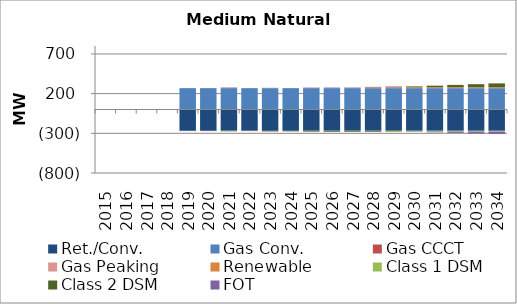
| Category | Ret./Conv. | Gas Conv. | Gas CCCT | Gas Peaking | Renewable | Class 1 DSM | Class 2 DSM | FOT |
|---|---|---|---|---|---|---|---|---|
| 2015.0 | 0 | 0 | 0 | 0 | 0 | 0 | -0.09 | 0.03 |
| 2016.0 | 0 | 0 | 0 | 0 | 0 | 0 | -0.1 | 0.035 |
| 2017.0 | 0 | 0 | 0 | 0 | 0 | 0 | -0.35 | 0.186 |
| 2018.0 | 0 | 0 | 0 | 0 | 0 | 0 | -0.61 | 0.269 |
| 2019.0 | -268 | 269 | 0 | 0 | 0 | 0 | -1.35 | -2.415 |
| 2020.0 | -268 | 269 | 0 | 0 | 0 | 0 | -1.36 | -2.876 |
| 2021.0 | -268 | 269 | 0 | 0 | 0 | -7.45 | -1.35 | 7.584 |
| 2022.0 | -268 | 269 | 0 | 0 | 0 | -2.43 | -1.5 | -0.375 |
| 2023.0 | -268 | 269 | 0 | 0 | 0 | 4.72 | -7.15 | -2.98 |
| 2024.0 | -268 | 269 | 0 | 0 | 0 | 0.99 | -7.31 | 1.116 |
| 2025.0 | -268 | 269 | 0 | 0 | 0 | -4.03 | -7.79 | 6.391 |
| 2026.0 | -268 | 269 | 0 | 0 | 0 | -4.03 | -9.16 | 7.248 |
| 2027.0 | -268 | 269 | 0 | 0 | 0 | -4.03 | -9.08 | 7.175 |
| 2028.0 | -268 | 269 | 0 | 0 | 12 | -4.03 | -8.99 | 4.198 |
| 2029.0 | -268 | 269 | 0 | 0 | 12 | -14.58 | 1.12 | 7.784 |
| 2030.0 | -268 | 269 | 0 | 0 | 12 | -11.18 | 10.22 | -2.281 |
| 2031.0 | -268 | 269 | 0 | 0 | 12 | -11.18 | 19.18 | -8.878 |
| 2032.0 | -268 | 269 | 0 | 0 | 12 | -11.18 | 28.76 | -15.814 |
| 2033.0 | -268 | 269 | 0 | 0 | 12 | -11.18 | 37.86 | -22.564 |
| 2034.0 | -268 | 269 | 0 | 0 | 12 | -10.09 | 47.89 | -31.042 |